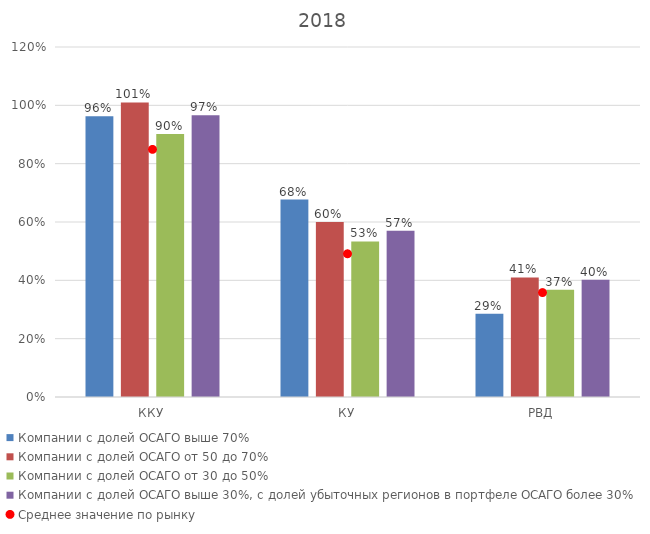
| Category | Компании с долей ОСАГО выше 70% | Компании с долей ОСАГО от 50 до 70% | Компании с долей ОСАГО от 30 до 50% | Компании с долей ОСАГО выше 30%, с долей убыточных регионов в портфеле ОСАГО более 30% |
|---|---|---|---|---|
| ККУ | 0.963 | 1.01 | 0.901 | 0.966 |
| КУ | 0.677 | 0.6 | 0.533 | 0.57 |
| РВД | 0.285 | 0.41 | 0.368 | 0.402 |